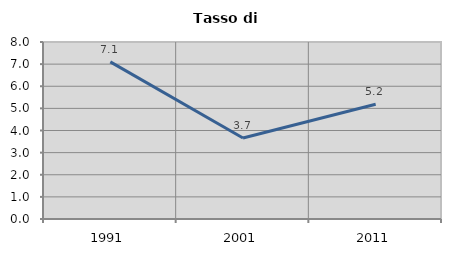
| Category | Tasso di disoccupazione   |
|---|---|
| 1991.0 | 7.101 |
| 2001.0 | 3.658 |
| 2011.0 | 5.184 |